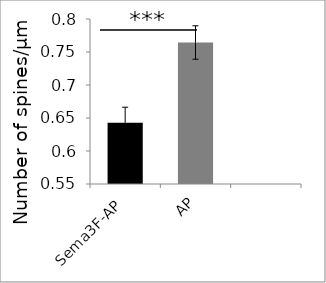
| Category | Series 0 |
|---|---|
| Sema3F-AP | 0.643 |
| AP | 0.764 |